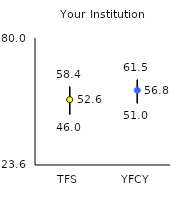
| Category | 25th | 75th | Mean |
|---|---|---|---|
| TFS | 46 | 58.4 | 52.63 |
| YFCY | 51 | 61.5 | 56.75 |